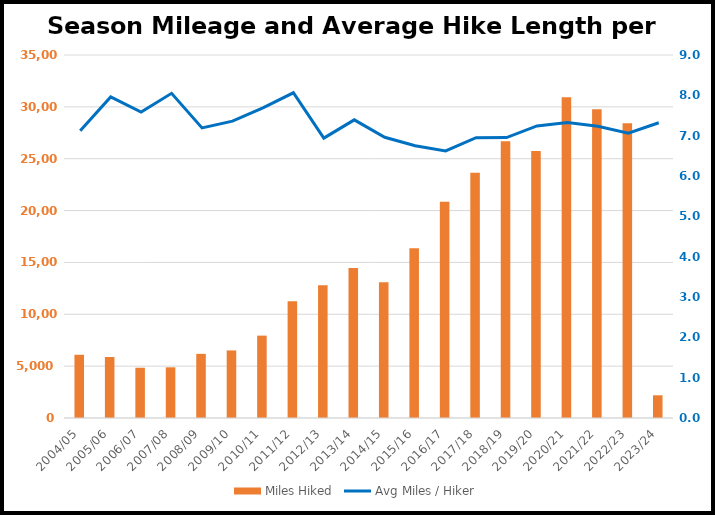
| Category | Miles Hiked |
|---|---|
| 2004/05 | 6096 |
| 2005/06 | 5883.5 |
| 2006/07 | 4845.9 |
| 2007/08 | 4886.2 |
| 2008/09 | 6185.9 |
| 2009/10 | 6514.1 |
| 2010/11 | 7942 |
| 2011/12 | 11256.3 |
| 2012/13 | 12802.9 |
| 2013/14 | 14458.8 |
| 2014/15 | 13084 |
| 2015/16 | 16366.9 |
| 2016/17 | 20847.4 |
| 2017/18 | 23653.7 |
| 2018/19 | 26678 |
| 2019/20 | 25732.2 |
| 2020/21 | 30922.711 |
| 2021/22 | 29779.443 |
| 2022/23 | 28431.3 |
| 2023/24 | 2189.05 |